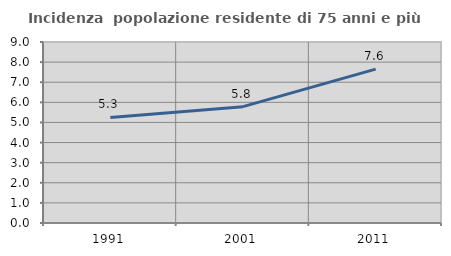
| Category | Incidenza  popolazione residente di 75 anni e più |
|---|---|
| 1991.0 | 5.25 |
| 2001.0 | 5.786 |
| 2011.0 | 7.649 |